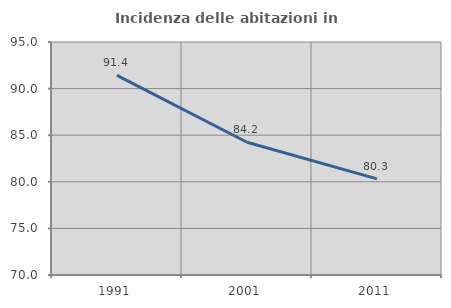
| Category | Incidenza delle abitazioni in proprietà  |
|---|---|
| 1991.0 | 91.415 |
| 2001.0 | 84.243 |
| 2011.0 | 80.312 |